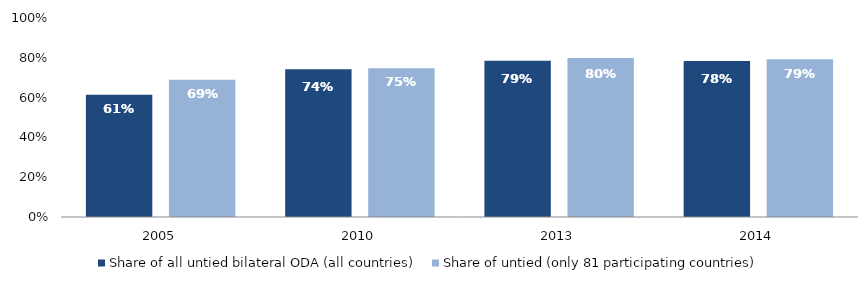
| Category | Share of all untied bilateral ODA (all countries) | Share of untied (only 81 participating countries) |
|---|---|---|
| 2005.0 | 0.615 | 0.69 |
| 2010.0 | 0.742 | 0.748 |
| 2013.0 | 0.786 | 0.799 |
| 2014.0 | 0.784 | 0.793 |